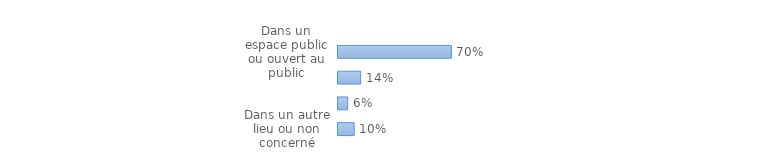
| Category | Series 0 |
|---|---|
| Dans un espace public ou ouvert au public | 0.7 |
| Sur le lieu de travail ou d'études  | 0.14 |
| Dans une habitation (domicile ou immeuble de la victime, domicile d'une autre personne) | 0.06 |
| Dans un autre lieu ou non concerné | 0.1 |